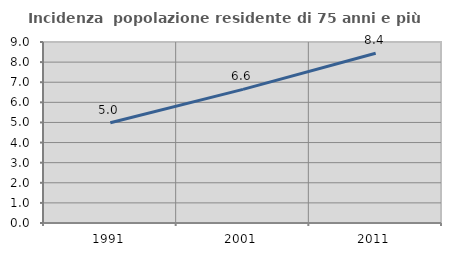
| Category | Incidenza  popolazione residente di 75 anni e più |
|---|---|
| 1991.0 | 4.984 |
| 2001.0 | 6.646 |
| 2011.0 | 8.441 |